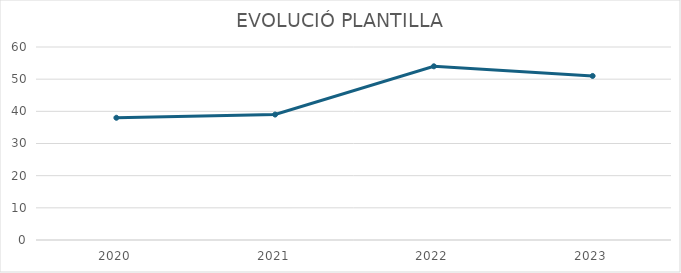
| Category | Plantilla final |
|---|---|
| 2020.0 | 38 |
| 2021.0 | 39 |
| 2022.0 | 54 |
| 2023.0 | 51 |